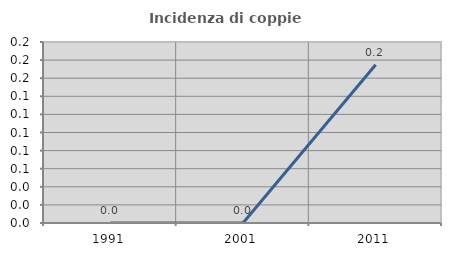
| Category | Incidenza di coppie miste |
|---|---|
| 1991.0 | 0 |
| 2001.0 | 0 |
| 2011.0 | 0.175 |